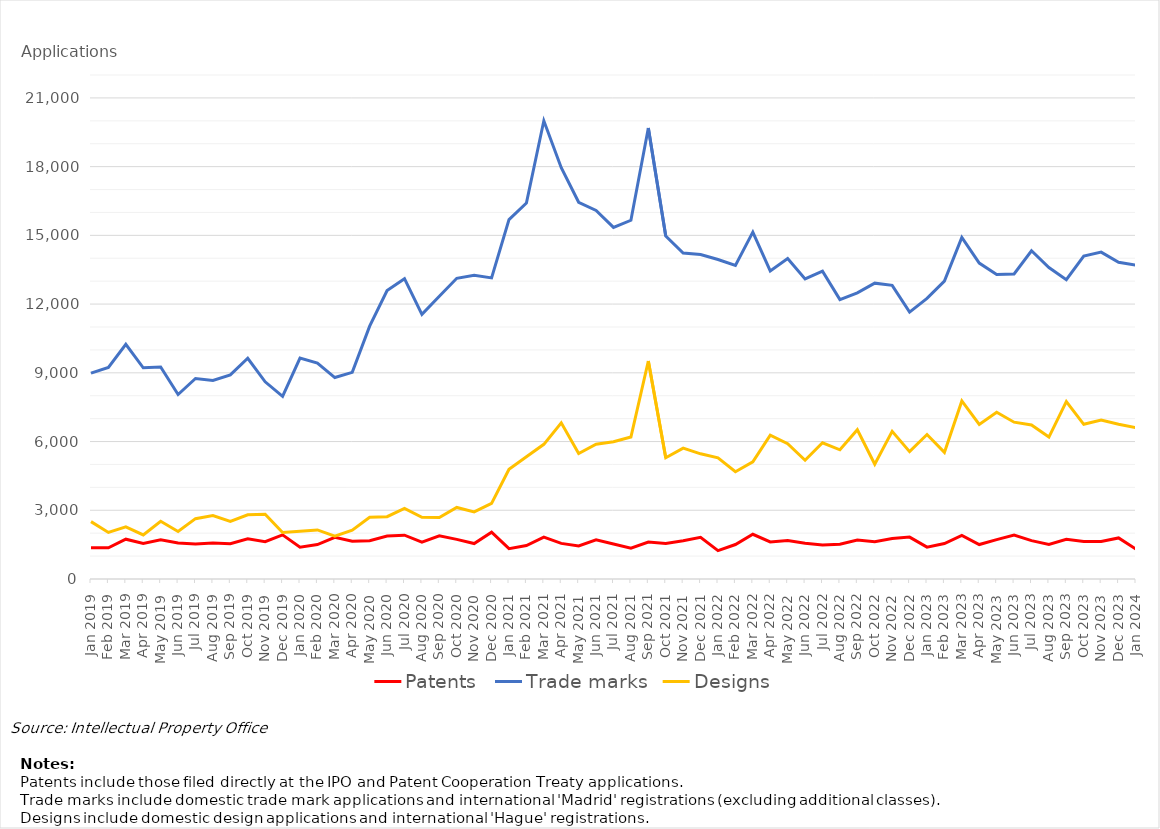
| Category | Patents | Trade marks | Designs |
|---|---|---|---|
| Jan 2019 | 1367 | 8985 | 2505 |
| Feb 2019 | 1361 | 9234 | 2031 |
| Mar 2019 | 1737 | 10243 | 2274 |
| Apr 2019 | 1552 | 9219 | 1923 |
| May 2019 | 1710 | 9251 | 2520 |
| Jun 2019 | 1569 | 8053 | 2074 |
| Jul 2019 | 1527 | 8752 | 2634 |
| Aug 2019 | 1571 | 8670 | 2768 |
| Sep 2019 | 1540 | 8908 | 2511 |
| Oct 2019 | 1755 | 9636 | 2800 |
| Nov 2019 | 1630 | 8607 | 2827 |
| Dec 2019 | 1927 | 7970 | 2028 |
| Jan 2020 | 1391 | 9642 | 2082 |
| Feb 2020 | 1504 | 9428 | 2143 |
| Mar 2020 | 1819 | 8794 | 1872 |
| Apr 2020 | 1648 | 9021 | 2127 |
| May 2020 | 1672 | 11035 | 2695 |
| Jun 2020 | 1879 | 12593 | 2721 |
| Jul 2020 | 1912 | 13110 | 3086 |
| Aug 2020 | 1613 | 11551 | 2695 |
| Sep 2020 | 1886 | 12340 | 2686 |
| Oct 2020 | 1730 | 13126 | 3124 |
| Nov 2020 | 1548 | 13254 | 2930 |
| Dec 2020 | 2042 | 13144 | 3302 |
| Jan 2021 | 1324 | 15685 | 4792 |
| Feb 2021 | 1462 | 16413 | 5340 |
| Mar 2021 | 1828 | 20001 | 5878 |
| Apr 2021 | 1554 | 17951 | 6815 |
| May 2021 | 1446 | 16446 | 5480 |
| Jun 2021 | 1712 | 16090 | 5881 |
| Jul 2021 | 1528 | 15347 | 5989 |
| Aug 2021 | 1344 | 15659 | 6200 |
| Sep 2021 | 1615 | 19685 | 9517 |
| Oct 2021 | 1547 | 14968 | 5292 |
| Nov 2021 | 1670 | 14232 | 5712 |
| Dec 2021 | 1817 | 14162 | 5464 |
| Jan 2022 | 1240 | 13945 | 5287 |
| Feb 2022 | 1505 | 13690 | 4683 |
| Mar 2022 | 1952 | 15142 | 5114 |
| Apr 2022 | 1616 | 13450 | 6282 |
| May 2022 | 1683 | 13992 | 5907 |
| Jun 2022 | 1561 | 13096 | 5183 |
| Jul 2022 | 1483 | 13439 | 5948 |
| Aug 2022 | 1519 | 12197 | 5639 |
| Sep 2022 | 1703 | 12493 | 6515 |
| Oct 2022 | 1629 | 12914 | 5013 |
| Nov 2022 | 1770 | 12819 | 6447 |
| Dec 2022 | 1828 | 11650 | 5558 |
| Jan 2023 | 1390 | 12250 | 6307 |
| Feb 2023 | 1550 | 13001 | 5528 |
| Mar 2023 | 1907 | 14909 | 7774 |
| Apr 2023 | 1504 | 13791 | 6744 |
| May 2023 | 1717 | 13291 | 7281 |
| Jun 2023 | 1919 | 13316 | 6845 |
| Jul 2023 | 1675 | 14328 | 6721 |
| Aug 2023 | 1507 | 13594 | 6196 |
| Sep 2023 | 1731 | 13064 | 7742 |
| Oct 2023 | 1641 | 14094 | 6752 |
| Nov 2023 | 1637 | 14270 | 6941 |
| Dec 2023 | 1793 | 13824 | 6754 |
| Jan 2024 | 1300 | 13695 | 6607 |